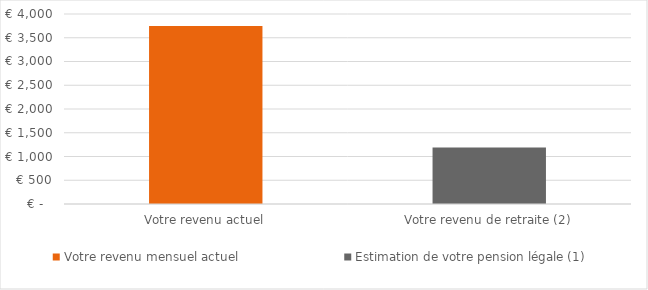
| Category | Votre revenu mensuel actuel | Estimation de votre pension légale (1) |
|---|---|---|
| Votre revenu actuel | 3750 | 0 |
| Votre revenu de retraite (2) | 0 | 1189.886 |